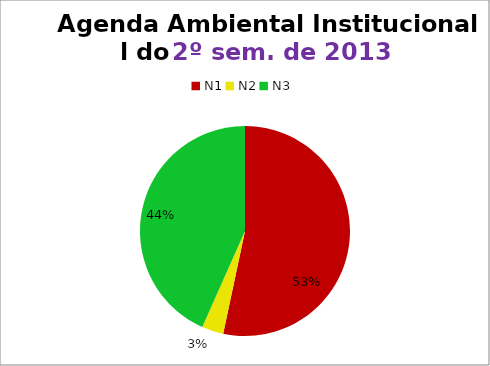
| Category | 2º/13 |
|---|---|
| N1 | 16 |
| N2 | 1 |
| N3 | 13 |